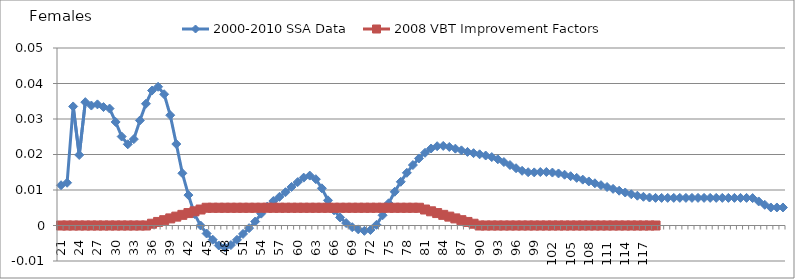
| Category | 2000-2010 SSA Data | 2008 VBT Improvement Factors |
|---|---|---|
| 21.0 | 0.011 | 0 |
| 22.0 | 0.012 | 0 |
| 23.0 | 0.034 | 0 |
| 24.0 | 0.02 | 0 |
| 25.0 | 0.035 | 0 |
| 26.0 | 0.034 | 0 |
| 27.0 | 0.034 | 0 |
| 28.0 | 0.033 | 0 |
| 29.0 | 0.033 | 0 |
| 30.0 | 0.029 | 0 |
| 31.0 | 0.025 | 0 |
| 32.0 | 0.023 | 0 |
| 33.0 | 0.024 | 0 |
| 34.0 | 0.03 | 0 |
| 35.0 | 0.034 | 0 |
| 36.0 | 0.038 | 0 |
| 37.0 | 0.039 | 0.001 |
| 38.0 | 0.037 | 0.002 |
| 39.0 | 0.031 | 0.002 |
| 40.0 | 0.023 | 0.002 |
| 41.0 | 0.015 | 0.003 |
| 42.0 | 0.009 | 0.004 |
| 43.0 | 0.003 | 0.004 |
| 44.0 | 0 | 0.004 |
| 45.0 | -0.002 | 0.005 |
| 46.0 | -0.004 | 0.005 |
| 47.0 | -0.006 | 0.005 |
| 48.0 | -0.006 | 0.005 |
| 49.0 | -0.006 | 0.005 |
| 50.0 | -0.004 | 0.005 |
| 51.0 | -0.002 | 0.005 |
| 52.0 | -0.001 | 0.005 |
| 53.0 | 0.001 | 0.005 |
| 54.0 | 0.003 | 0.005 |
| 55.0 | 0.005 | 0.005 |
| 56.0 | 0.007 | 0.005 |
| 57.0 | 0.008 | 0.005 |
| 58.0 | 0.009 | 0.005 |
| 59.0 | 0.011 | 0.005 |
| 60.0 | 0.012 | 0.005 |
| 61.0 | 0.013 | 0.005 |
| 62.0 | 0.014 | 0.005 |
| 63.0 | 0.013 | 0.005 |
| 64.0 | 0.01 | 0.005 |
| 65.0 | 0.007 | 0.005 |
| 66.0 | 0.004 | 0.005 |
| 67.0 | 0.002 | 0.005 |
| 68.0 | 0.001 | 0.005 |
| 69.0 | 0 | 0.005 |
| 70.0 | -0.001 | 0.005 |
| 71.0 | -0.002 | 0.005 |
| 72.0 | -0.001 | 0.005 |
| 73.0 | 0 | 0.005 |
| 74.0 | 0.003 | 0.005 |
| 75.0 | 0.006 | 0.005 |
| 76.0 | 0.01 | 0.005 |
| 77.0 | 0.012 | 0.005 |
| 78.0 | 0.015 | 0.005 |
| 79.0 | 0.017 | 0.005 |
| 80.0 | 0.019 | 0.005 |
| 81.0 | 0.02 | 0.004 |
| 82.0 | 0.022 | 0.004 |
| 83.0 | 0.022 | 0.004 |
| 84.0 | 0.022 | 0.003 |
| 85.0 | 0.022 | 0.002 |
| 86.0 | 0.022 | 0.002 |
| 87.0 | 0.021 | 0.002 |
| 88.0 | 0.021 | 0.001 |
| 89.0 | 0.02 | 0 |
| 90.0 | 0.02 | 0 |
| 91.0 | 0.02 | 0 |
| 92.0 | 0.019 | 0 |
| 93.0 | 0.019 | 0 |
| 94.0 | 0.018 | 0 |
| 95.0 | 0.017 | 0 |
| 96.0 | 0.016 | 0 |
| 97.0 | 0.015 | 0 |
| 98.0 | 0.015 | 0 |
| 99.0 | 0.015 | 0 |
| 100.0 | 0.015 | 0 |
| 101.0 | 0.015 | 0 |
| 102.0 | 0.015 | 0 |
| 103.0 | 0.015 | 0 |
| 104.0 | 0.014 | 0 |
| 105.0 | 0.014 | 0 |
| 106.0 | 0.013 | 0 |
| 107.0 | 0.013 | 0 |
| 108.0 | 0.012 | 0 |
| 109.0 | 0.012 | 0 |
| 110.0 | 0.011 | 0 |
| 111.0 | 0.011 | 0 |
| 112.0 | 0.01 | 0 |
| 113.0 | 0.01 | 0 |
| 114.0 | 0.009 | 0 |
| 115.0 | 0.009 | 0 |
| 116.0 | 0.008 | 0 |
| 117.0 | 0.008 | 0 |
| 118.0 | 0.008 | 0 |
| 119.0 | 0.008 | 0 |